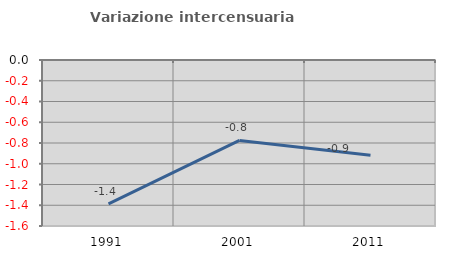
| Category | Variazione intercensuaria annua |
|---|---|
| 1991.0 | -1.386 |
| 2001.0 | -0.775 |
| 2011.0 | -0.918 |